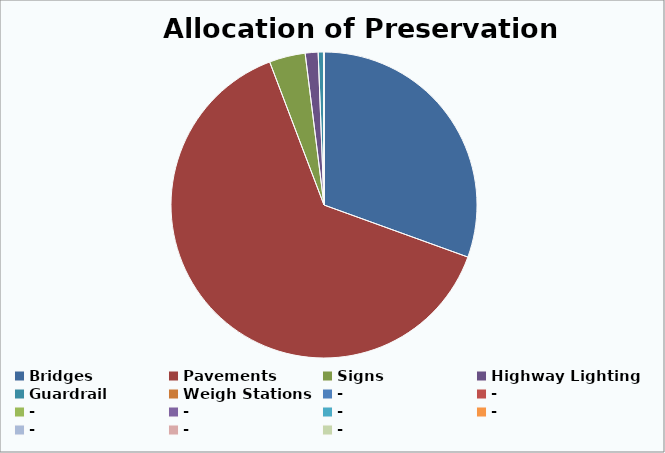
| Category | Series 0 |
|---|---|
| Bridges | 65633318.889 |
| Pavements | 136952029.581 |
| Signs | 8179595.257 |
| Highway Lighting | 2923409.197 |
| Guardrail | 1189669.517 |
| Weigh Stations | 121977.559 |
| - | 0 |
| - | 0 |
| - | 0 |
| - | 0 |
| - | 0 |
| - | 0 |
| - | 0 |
| - | 0 |
| - | 0 |